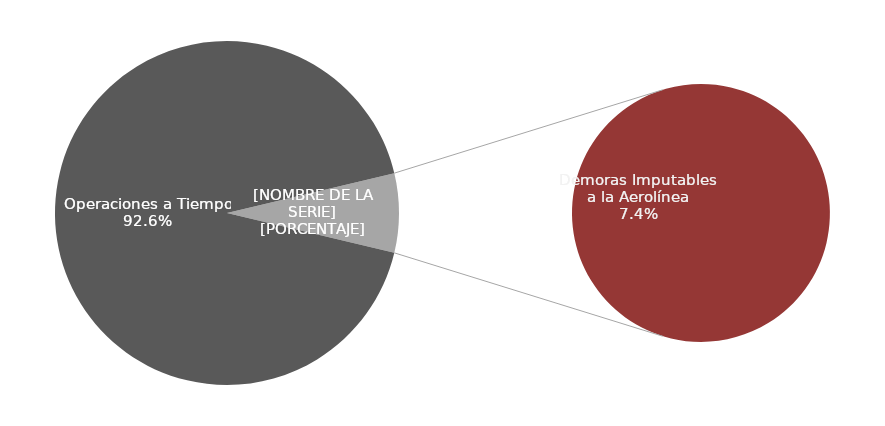
| Category | Demoras |
|---|---|
| Operaciones a Tiempo | 5260 |
| Demoras Imputables 
a la Aerolínea | 423 |
|    Aplicación de Control 
de Flujo | 0 |
|    Repercusiones por un 
Tercero | 0 |
|    Meteorologia | 0 |
|    Otras No Imputables | 0 |